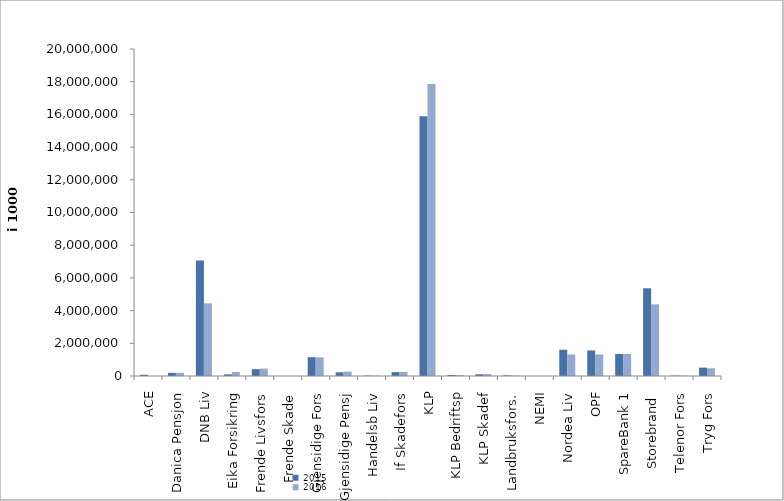
| Category | 2015 | 2016 |
|---|---|---|
| ACE | 78123.6 | 0 |
| Danica Pensjon | 191202.681 | 197548.729 |
| DNB Liv | 7065772.463 | 4445756.001 |
| Eika Forsikring | 101000 | 248926 |
| Frende Livsfors | 418681 | 449437 |
| Frende Skade | 3480 | 4457 |
| Gjensidige Fors | 1147821 | 1139361 |
| Gjensidige Pensj | 226186.261 | 268828.264 |
| Handelsb Liv | 21113 | 20615 |
| If Skadefors | 237735.09 | 248460.123 |
| KLP | 15886395.593 | 17863744.79 |
| KLP Bedriftsp | 60739 | 52817 |
| KLP Skadef | 105293.125 | 118032.765 |
| Landbruksfors. | 40550 | 17232 |
| NEMI | 2609 | 1481 |
| Nordea Liv | 1607888.37 | 1314347.701 |
| OPF | 1559758 | 1315437 |
| SpareBank 1 | 1343495.907 | 1347598.175 |
| Storebrand  | 5360124.083 | 4383879.605 |
| Telenor Fors | 24715 | 25828 |
| Tryg Fors | 511210.573 | 472129.781 |